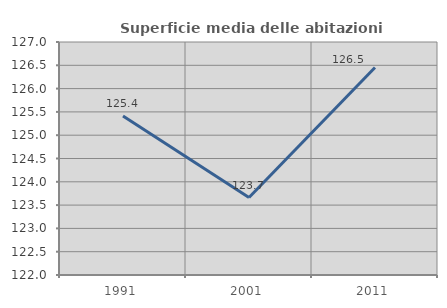
| Category | Superficie media delle abitazioni occupate |
|---|---|
| 1991.0 | 125.414 |
| 2001.0 | 123.663 |
| 2011.0 | 126.454 |